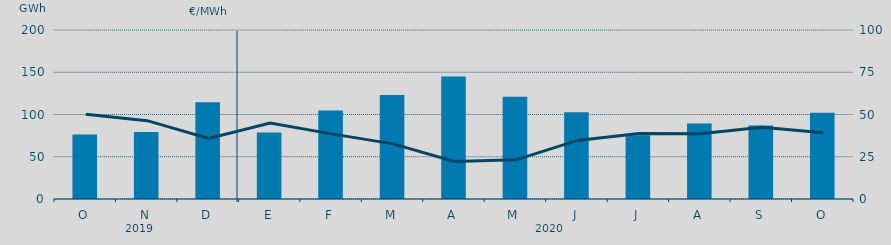
| Category | Energía a subir |
|---|---|
| O | 76.273 |
| N | 79.309 |
| D | 114.385 |
| E | 78.585 |
| F | 104.665 |
| M | 123.158 |
| A | 144.862 |
| M | 120.894 |
| J | 102.756 |
| J | 75.579 |
| A | 89.481 |
| S | 86.928 |
| O | 102.214 |